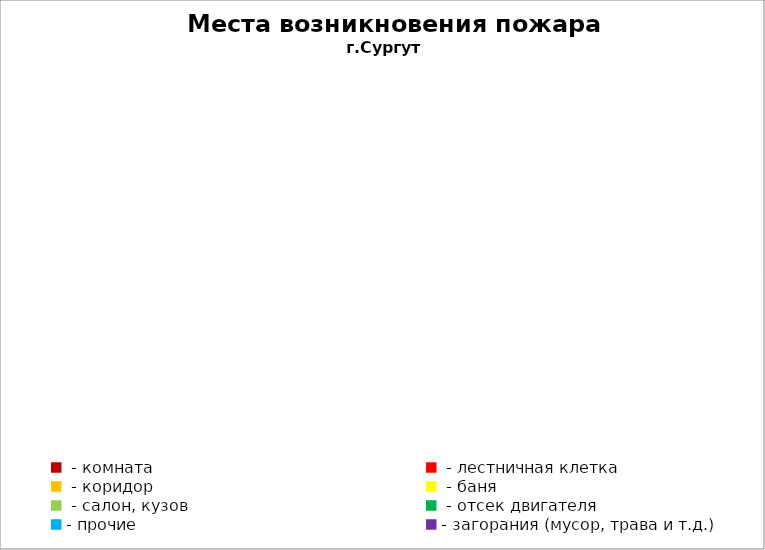
| Category | Места возникновения пожара |
|---|---|
|  - комната | 61 |
|  - лестничная клетка | 14 |
|  - коридор | 11 |
|  - баня | 34 |
|  - салон, кузов | 23 |
|  - отсек двигателя | 41 |
| - прочие | 90 |
| - загорания (мусор, трава и т.д.)  | 157 |